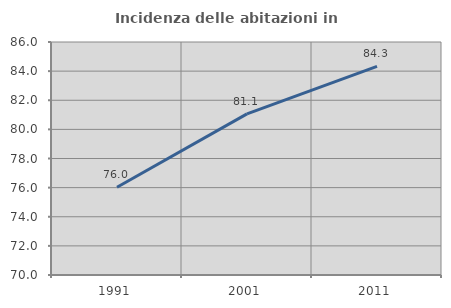
| Category | Incidenza delle abitazioni in proprietà  |
|---|---|
| 1991.0 | 76.029 |
| 2001.0 | 81.061 |
| 2011.0 | 84.328 |